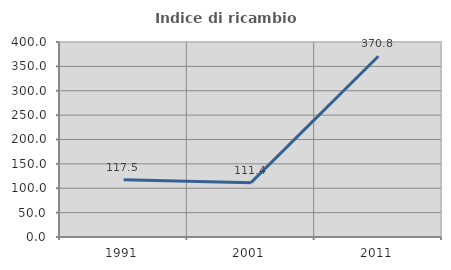
| Category | Indice di ricambio occupazionale  |
|---|---|
| 1991.0 | 117.467 |
| 2001.0 | 111.429 |
| 2011.0 | 370.769 |